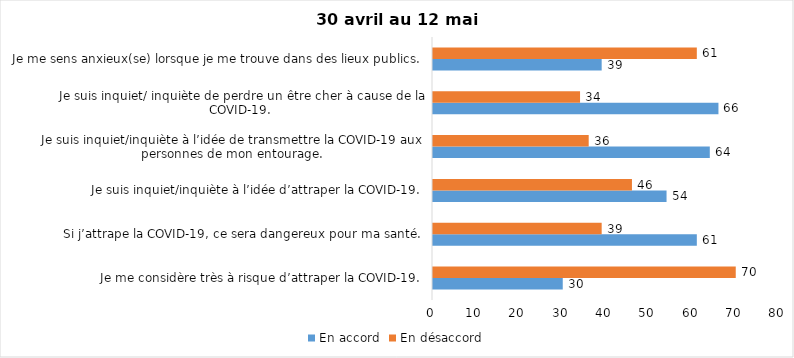
| Category | En accord | En désaccord |
|---|---|---|
| Je me considère très à risque d’attraper la COVID-19. | 30 | 70 |
| Si j’attrape la COVID-19, ce sera dangereux pour ma santé. | 61 | 39 |
| Je suis inquiet/inquiète à l’idée d’attraper la COVID-19. | 54 | 46 |
| Je suis inquiet/inquiète à l’idée de transmettre la COVID-19 aux personnes de mon entourage. | 64 | 36 |
| Je suis inquiet/ inquiète de perdre un être cher à cause de la COVID-19. | 66 | 34 |
| Je me sens anxieux(se) lorsque je me trouve dans des lieux publics. | 39 | 61 |